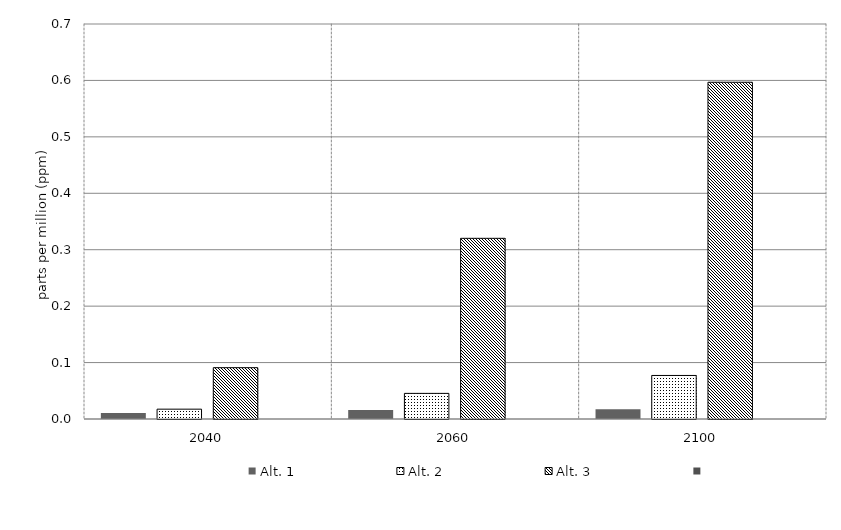
| Category | Alt. 1 | Alt. 2 | Alt. 3 | Series 3 | Alt 5 | Alt 6 | Alt 7 | Alt 8 | Alt 10 |
|---|---|---|---|---|---|---|---|---|---|
| 2040.0 | 0.011 | 0.017 | 0.091 |  |  |  |  |  |  |
| 2060.0 | 0.016 | 0.045 | 0.32 |  |  |  |  |  |  |
| 2100.0 | 0.017 | 0.077 | 0.597 |  |  |  |  |  |  |